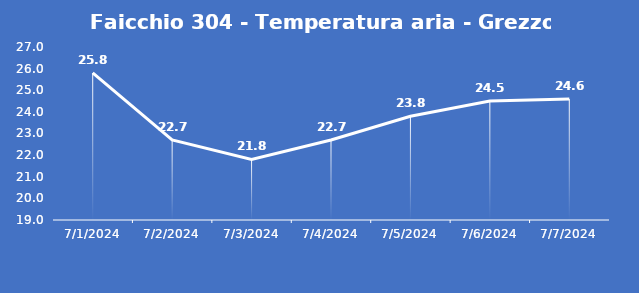
| Category | Faicchio 304 - Temperatura aria - Grezzo (°C) |
|---|---|
| 7/1/24 | 25.8 |
| 7/2/24 | 22.7 |
| 7/3/24 | 21.8 |
| 7/4/24 | 22.7 |
| 7/5/24 | 23.8 |
| 7/6/24 | 24.5 |
| 7/7/24 | 24.6 |